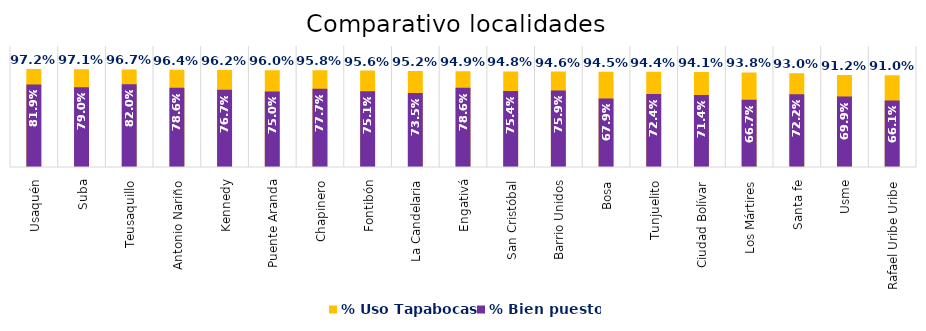
| Category | % Uso Tapabocas | % Bien puesto |
|---|---|---|
| Usaquén | 0.972 | 0.819 |
| Suba | 0.971 | 0.79 |
| Teusaquillo | 0.967 | 0.82 |
| Antonio Nariño | 0.964 | 0.786 |
| Kennedy | 0.962 | 0.767 |
| Puente Aranda | 0.96 | 0.75 |
| Chapinero | 0.958 | 0.777 |
| Fontibón | 0.956 | 0.751 |
| La Candelaria | 0.952 | 0.735 |
| Engativá | 0.949 | 0.786 |
| San Cristóbal | 0.948 | 0.754 |
| Barrio Unidos | 0.946 | 0.759 |
| Bosa | 0.945 | 0.679 |
| Tunjuelito | 0.944 | 0.724 |
| Ciudad Bolívar | 0.941 | 0.714 |
| Los Mártires | 0.938 | 0.667 |
| Santa fe | 0.93 | 0.722 |
| Usme | 0.912 | 0.699 |
| Rafael Uribe Uribe | 0.91 | 0.661 |